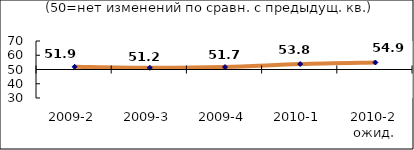
| Category | Диф.индекс ↓ |
|---|---|
| 2009-2 | 51.895 |
| 2009-3 | 51.195 |
| 2009-4 | 51.725 |
| 2010-1 | 53.83 |
| 2010-2 ожид. | 54.92 |